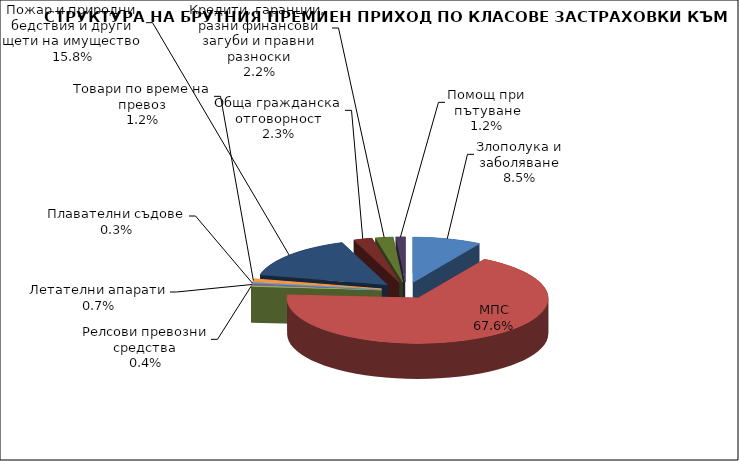
| Category | Злополука и заболяване |
|---|---|
| Злополука и заболяване | 0.085 |
| МПС | 0.676 |
| Релсови превозни средства | 0.004 |
| Летателни апарати | 0.007 |
| Плавателни съдове | 0.003 |
| Товари по време на превоз | 0.012 |
| Пожар и природни бедствия и други щети на имущество | 0.158 |
| Обща гражданска отговорност | 0.023 |
| Кредити, гаранции, разни финансови загуби и правни разноски | 0.022 |
| Помощ при пътуване | 0.012 |